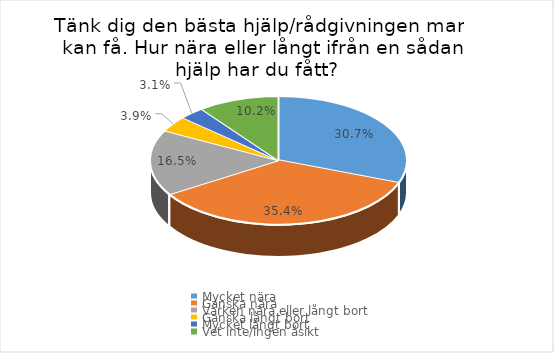
| Category | Series 0 |
|---|---|
| Mycket nära | 0.307 |
| Ganska nära | 0.354 |
| Varken nära eller långt bort | 0.165 |
| Ganska långt bort | 0.039 |
| Mycket långt bort | 0.031 |
| Vet inte/ingen åsikt | 0.102 |